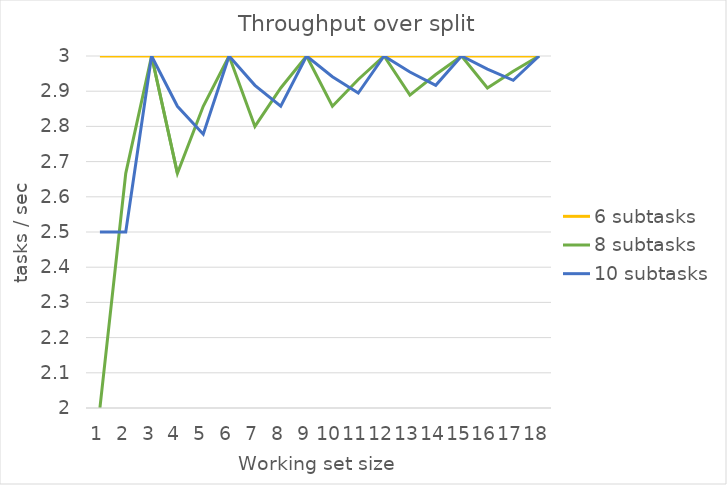
| Category | 6 subtasks | 8 subtasks | 10 subtasks |
|---|---|---|---|
| 0 | 3 | 2 | 2.5 |
| 1 | 3 | 2.667 | 2.5 |
| 2 | 3 | 3 | 3 |
| 3 | 3 | 2.667 | 2.857 |
| 4 | 3 | 2.857 | 2.778 |
| 5 | 3 | 3 | 3 |
| 6 | 3 | 2.8 | 2.917 |
| 7 | 3 | 2.909 | 2.857 |
| 8 | 3 | 3 | 3 |
| 9 | 3 | 2.857 | 2.941 |
| 10 | 3 | 2.933 | 2.895 |
| 11 | 3 | 3 | 3 |
| 12 | 3 | 2.889 | 2.955 |
| 13 | 3 | 2.947 | 2.917 |
| 14 | 3 | 3 | 3 |
| 15 | 3 | 2.909 | 2.963 |
| 16 | 3 | 2.957 | 2.931 |
| 17 | 3 | 3 | 3 |